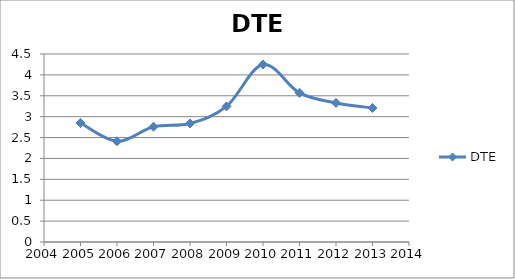
| Category | DTE |
|---|---|
| 2005.0 | 2.848 |
| 2006.0 | 2.411 |
| 2007.0 | 2.759 |
| 2008.0 | 2.838 |
| 2009.0 | 3.245 |
| 2010.0 | 4.247 |
| 2011.0 | 3.569 |
| 2012.0 | 3.329 |
| 2013.0 | 3.208 |